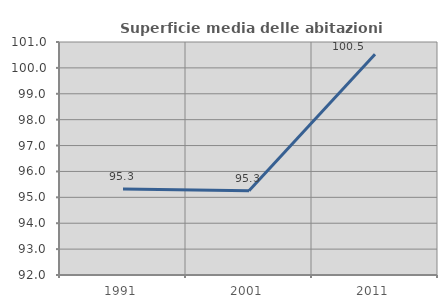
| Category | Superficie media delle abitazioni occupate |
|---|---|
| 1991.0 | 95.319 |
| 2001.0 | 95.257 |
| 2011.0 | 100.525 |